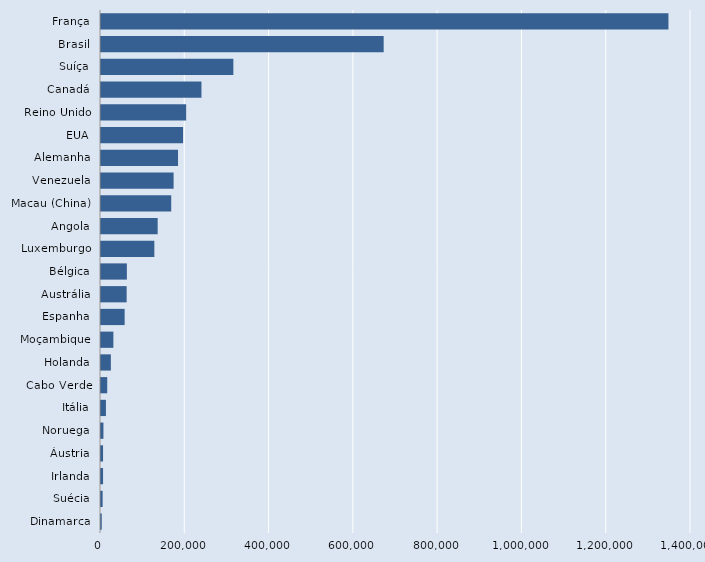
| Category | Series 0 |
|---|---|
| Dinamarca | 1784 |
| Suécia | 3859 |
| Irlanda | 4879 |
| Áustria | 4883 |
| Noruega | 5775 |
| Itália | 11673 |
| Cabo Verde | 14795 |
| Holanda | 23409 |
| Moçambique | 29360 |
| Espanha | 56104 |
| Austrália | 60860 |
| Bélgica | 61376 |
| Luxemburgo | 126602 |
| Angola | 134473 |
| Macau (China) | 166593 |
| Venezuela | 172266 |
| Alemanha | 182762 |
| EUA | 194728 |
| Reino Unido | 202072 |
| Canadá | 238369 |
| Suíça | 314081 |
| Brasil | 670760 |
| França | 1346472 |